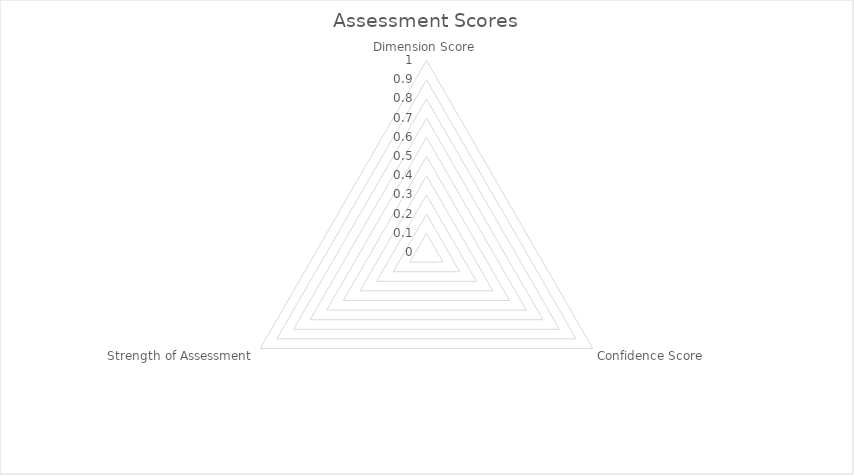
| Category | Series 0 |
|---|---|
| Dimension Score | 0 |
| Confidence Score | 0 |
| Strength of Assessment | 0 |